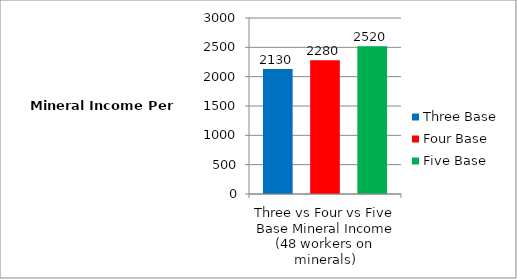
| Category | Three Base | Four Base | Five Base |
|---|---|---|---|
| 0 | 2130 | 2280 | 2520 |